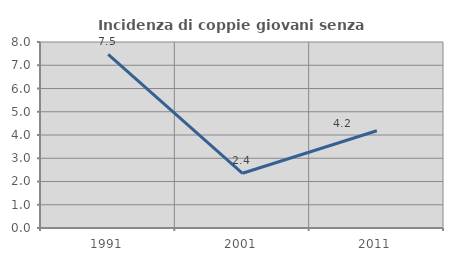
| Category | Incidenza di coppie giovani senza figli |
|---|---|
| 1991.0 | 7.469 |
| 2001.0 | 2.353 |
| 2011.0 | 4.181 |